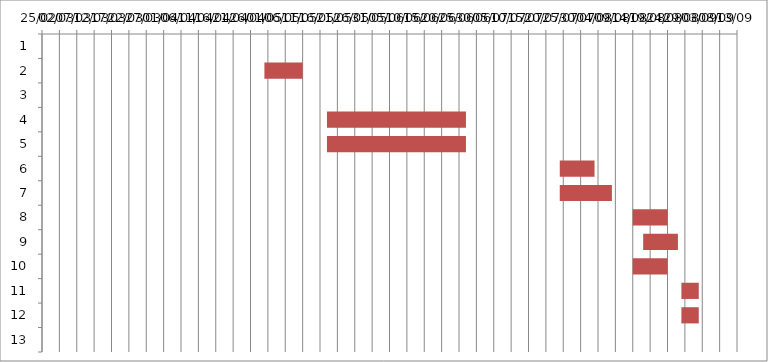
| Category | Fecha de inicio | DURACIÓN |
|---|---|---|
| 0 | 5/5/15 | 0 |
| 1 | 4/30/15 | 11 |
| 2 | 5/18/15 | 0 |
| 3 | 5/18/15 | 40 |
| 4 | 5/18/15 | 40 |
| 5 | 7/24/15 | 10 |
| 6 | 7/24/15 | 15 |
| 7 | 8/14/15 | 10 |
| 8 | 8/17/15 | 10 |
| 9 | 8/14/15 | 10 |
| 10 | 8/28/15 | 5 |
| 11 | 8/28/15 | 5 |
| 12 | 9/3/15 | 0 |